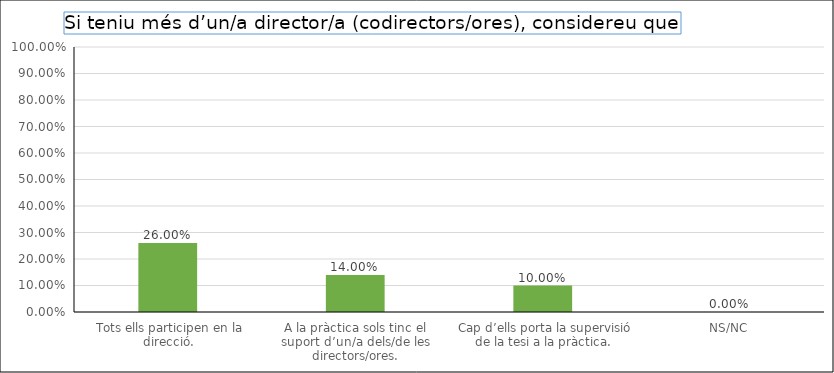
| Category | Series 0 |
|---|---|
|  Tots ells participen en la direcció. | 0.26 |
| A la pràctica sols tinc el suport d’un/a dels/de les directors/ores. | 0.14 |
|  Cap d’ells porta la supervisió de la tesi a la pràctica. | 0.1 |
| NS/NC | 0 |